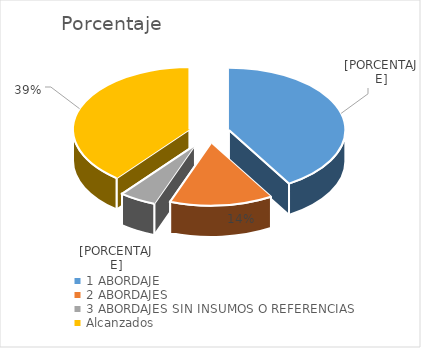
| Category | Porcentaje |
|---|---|
| 1 ABORDAJE  | 0.414 |
| 2 ABORDAJES | 0.143 |
| 3 ABORDAJES SIN INSUMOS O REFERENCIAS | 0.051 |
| Alcanzados | 0.392 |